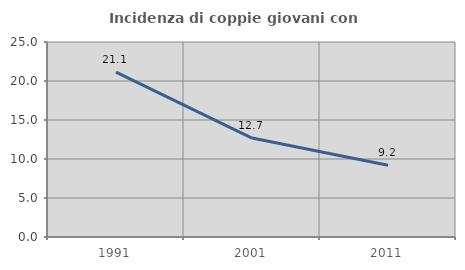
| Category | Incidenza di coppie giovani con figli |
|---|---|
| 1991.0 | 21.131 |
| 2001.0 | 12.689 |
| 2011.0 | 9.204 |